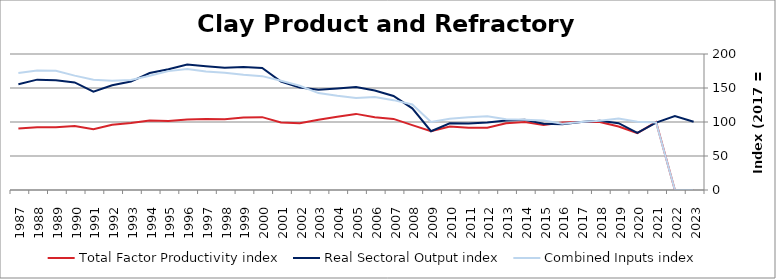
| Category | Total Factor Productivity index | Real Sectoral Output index | Combined Inputs index |
|---|---|---|---|
| 2023.0 | 0 | 100.314 | 0 |
| 2022.0 | 0 | 108.879 | 0 |
| 2021.0 | 99.87 | 99.185 | 99.314 |
| 2020.0 | 83.756 | 84.026 | 100.323 |
| 2019.0 | 93.294 | 98.221 | 105.282 |
| 2018.0 | 99.823 | 101.824 | 102.005 |
| 2017.0 | 100 | 100 | 100 |
| 2016.0 | 99.145 | 96.563 | 97.396 |
| 2015.0 | 95.432 | 97.526 | 102.194 |
| 2014.0 | 100.055 | 103.216 | 103.159 |
| 2013.0 | 98.2 | 102.178 | 104.051 |
| 2012.0 | 91.522 | 99.325 | 108.526 |
| 2011.0 | 91.599 | 97.832 | 106.805 |
| 2010.0 | 93.465 | 98.068 | 104.924 |
| 2009.0 | 86.405 | 86.459 | 100.063 |
| 2008.0 | 95.475 | 120.081 | 125.773 |
| 2007.0 | 104.584 | 138.199 | 132.141 |
| 2006.0 | 106.859 | 146.274 | 136.884 |
| 2005.0 | 111.926 | 151.323 | 135.199 |
| 2004.0 | 107.689 | 149.166 | 138.516 |
| 2003.0 | 103.372 | 147.296 | 142.491 |
| 2002.0 | 98.178 | 150.574 | 153.369 |
| 2001.0 | 99.328 | 159.554 | 160.634 |
| 2000.0 | 107.137 | 179.389 | 167.439 |
| 1999.0 | 106.64 | 180.719 | 169.467 |
| 1998.0 | 104.154 | 179.681 | 172.514 |
| 1997.0 | 104.404 | 181.918 | 174.244 |
| 1996.0 | 103.719 | 184.646 | 178.025 |
| 1995.0 | 101.642 | 177.698 | 174.828 |
| 1994.0 | 102.332 | 172.051 | 168.13 |
| 1993.0 | 98.569 | 159.499 | 161.815 |
| 1992.0 | 95.974 | 154.028 | 160.49 |
| 1991.0 | 89.26 | 144.589 | 161.986 |
| 1990.0 | 94.021 | 158.134 | 168.189 |
| 1989.0 | 92.122 | 161.452 | 175.259 |
| 1988.0 | 92.443 | 162.294 | 175.562 |
| 1987.0 | 90.41 | 155.621 | 172.127 |